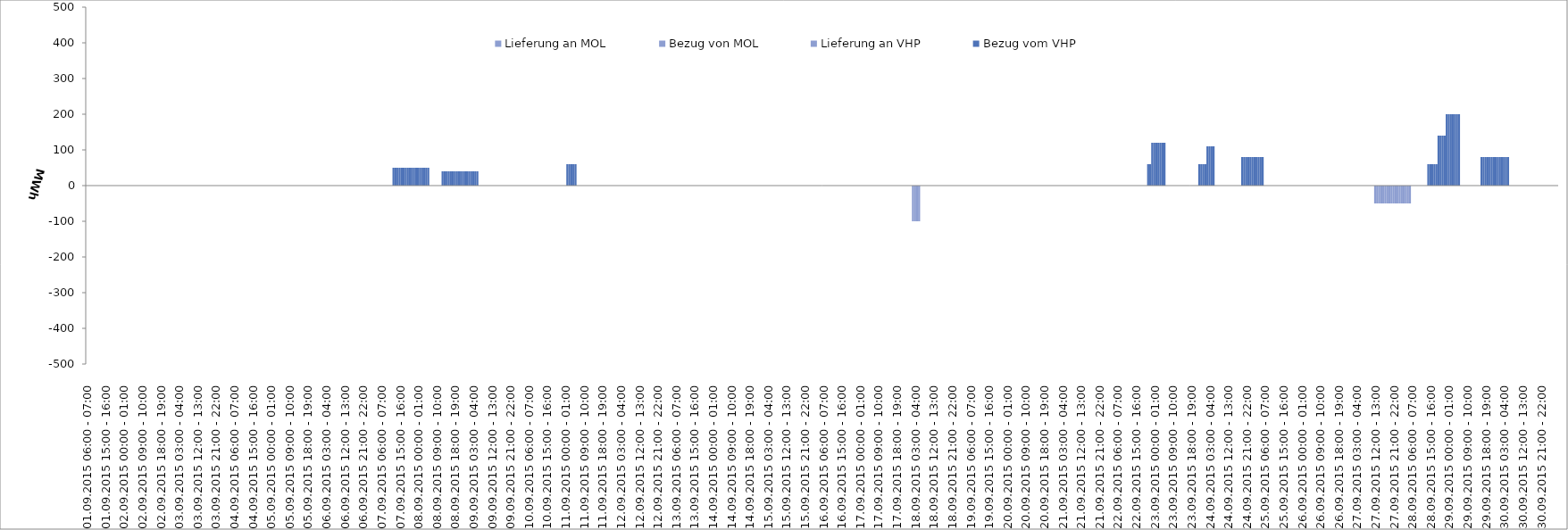
| Category | Bezug vom VHP | Lieferung an VHP | Bezug von MOL | Lieferung an MOL |
|---|---|---|---|---|
| 01.09.2015 06:00 - 07:00 | 0 | 0 | 0 | 0 |
| 01.09.2015 07:00 - 08:00 | 0 | 0 | 0 | 0 |
| 01.09.2015 08:00 - 09:00 | 0 | 0 | 0 | 0 |
| 01.09.2015 09:00 - 10:00 | 0 | 0 | 0 | 0 |
| 01.09.2015 10:00 - 11:00 | 0 | 0 | 0 | 0 |
| 01.09.2015 11:00 - 12:00 | 0 | 0 | 0 | 0 |
| 01.09.2015 12:00 - 13:00 | 0 | 0 | 0 | 0 |
| 01.09.2015 13:00 - 14:00 | 0 | 0 | 0 | 0 |
| 01.09.2015 14:00 - 15:00 | 0 | 0 | 0 | 0 |
| 01.09.2015 15:00 - 16:00 | 0 | 0 | 0 | 0 |
| 01.09.2015 16:00 - 17:00 | 0 | 0 | 0 | 0 |
| 01.09.2015 17:00 - 18:00 | 0 | 0 | 0 | 0 |
| 01.09.2015 18:00 - 19:00 | 0 | 0 | 0 | 0 |
| 01.09.2015 19:00 - 20:00 | 0 | 0 | 0 | 0 |
| 01.09.2015 20:00 - 21:00 | 0 | 0 | 0 | 0 |
| 01.09.2015 21:00 - 22:00 | 0 | 0 | 0 | 0 |
| 01.09.2015 22:00 - 23:00 | 0 | 0 | 0 | 0 |
| 01.09.2015 23:00 - 24:00 | 0 | 0 | 0 | 0 |
| 02.09.2015 00:00 - 01:00 | 0 | 0 | 0 | 0 |
| 02.09.2015 01:00 - 02:00 | 0 | 0 | 0 | 0 |
| 02.09.2015 02:00 - 03:00 | 0 | 0 | 0 | 0 |
| 02.09.2015 03:00 - 04:00 | 0 | 0 | 0 | 0 |
| 02.09.2015 04:00 - 05:00 | 0 | 0 | 0 | 0 |
| 02.09.2015 05:00 - 06:00 | 0 | 0 | 0 | 0 |
| 02.09.2015 06:00 - 07:00 | 0 | 0 | 0 | 0 |
| 02.09.2015 07:00 - 08:00 | 0 | 0 | 0 | 0 |
| 02.09.2015 08:00 - 09:00 | 0 | 0 | 0 | 0 |
| 02.09.2015 09:00 - 10:00 | 0 | 0 | 0 | 0 |
| 02.09.2015 10:00 - 11:00 | 0 | 0 | 0 | 0 |
| 02.09.2015 11:00 - 12:00 | 0 | 0 | 0 | 0 |
| 02.09.2015 12:00 - 13:00 | 0 | 0 | 0 | 0 |
| 02.09.2015 13:00 - 14:00 | 0 | 0 | 0 | 0 |
| 02.09.2015 14:00 - 15:00 | 0 | 0 | 0 | 0 |
| 02.09.2015 15:00 - 16:00 | 0 | 0 | 0 | 0 |
| 02.09.2015 16:00 - 17:00 | 0 | 0 | 0 | 0 |
| 02.09.2015 17:00 - 18:00 | 0 | 0 | 0 | 0 |
| 02.09.2015 18:00 - 19:00 | 0 | 0 | 0 | 0 |
| 02.09.2015 19:00 - 20:00 | 0 | 0 | 0 | 0 |
| 02.09.2015 20:00 - 21:00 | 0 | 0 | 0 | 0 |
| 02.09.2015 21:00 - 22:00 | 0 | 0 | 0 | 0 |
| 02.09.2015 22:00 - 23:00 | 0 | 0 | 0 | 0 |
| 02.09.2015 23:00 - 24:00 | 0 | 0 | 0 | 0 |
| 03.09.2015 00:00 - 01:00 | 0 | 0 | 0 | 0 |
| 03.09.2015 01:00 - 02:00 | 0 | 0 | 0 | 0 |
| 03.09.2015 02:00 - 03:00 | 0 | 0 | 0 | 0 |
| 03.09.2015 03:00 - 04:00 | 0 | 0 | 0 | 0 |
| 03.09.2015 04:00 - 05:00 | 0 | 0 | 0 | 0 |
| 03.09.2015 05:00 - 06:00 | 0 | 0 | 0 | 0 |
| 03.09.2015 06:00 - 07:00 | 0 | 0 | 0 | 0 |
| 03.09.2015 07:00 - 08:00 | 0 | 0 | 0 | 0 |
| 03.09.2015 08:00 - 09:00 | 0 | 0 | 0 | 0 |
| 03.09.2015 09:00 - 10:00 | 0 | 0 | 0 | 0 |
| 03.09.2015 10:00 - 11:00 | 0 | 0 | 0 | 0 |
| 03.09.2015 11:00 - 12:00 | 0 | 0 | 0 | 0 |
| 03.09.2015 12:00 - 13:00 | 0 | 0 | 0 | 0 |
| 03.09.2015 13:00 - 14:00 | 0 | 0 | 0 | 0 |
| 03.09.2015 14:00 - 15:00 | 0 | 0 | 0 | 0 |
| 03.09.2015 15:00 - 16:00 | 0 | 0 | 0 | 0 |
| 03.09.2015 16:00 - 17:00 | 0 | 0 | 0 | 0 |
| 03.09.2015 17:00 - 18:00 | 0 | 0 | 0 | 0 |
| 03.09.2015 18:00 - 19:00 | 0 | 0 | 0 | 0 |
| 03.09.2015 19:00 - 20:00 | 0 | 0 | 0 | 0 |
| 03.09.2015 20:00 - 21:00 | 0 | 0 | 0 | 0 |
| 03.09.2015 21:00 - 22:00 | 0 | 0 | 0 | 0 |
| 03.09.2015 22:00 - 23:00 | 0 | 0 | 0 | 0 |
| 03.09.2015 23:00 - 24:00 | 0 | 0 | 0 | 0 |
| 04.09.2015 00:00 - 01:00 | 0 | 0 | 0 | 0 |
| 04.09.2015 01:00 - 02:00 | 0 | 0 | 0 | 0 |
| 04.09.2015 02:00 - 03:00 | 0 | 0 | 0 | 0 |
| 04.09.2015 03:00 - 04:00 | 0 | 0 | 0 | 0 |
| 04.09.2015 04:00 - 05:00 | 0 | 0 | 0 | 0 |
| 04.09.2015 05:00 - 06:00 | 0 | 0 | 0 | 0 |
| 04.09.2015 06:00 - 07:00 | 0 | 0 | 0 | 0 |
| 04.09.2015 07:00 - 08:00 | 0 | 0 | 0 | 0 |
| 04.09.2015 08:00 - 09:00 | 0 | 0 | 0 | 0 |
| 04.09.2015 09:00 - 10:00 | 0 | 0 | 0 | 0 |
| 04.09.2015 10:00 - 11:00 | 0 | 0 | 0 | 0 |
| 04.09.2015 11:00 - 12:00 | 0 | 0 | 0 | 0 |
| 04.09.2015 12:00 - 13:00 | 0 | 0 | 0 | 0 |
| 04.09.2015 13:00 - 14:00 | 0 | 0 | 0 | 0 |
| 04.09.2015 14:00 - 15:00 | 0 | 0 | 0 | 0 |
| 04.09.2015 15:00 - 16:00 | 0 | 0 | 0 | 0 |
| 04.09.2015 16:00 - 17:00 | 0 | 0 | 0 | 0 |
| 04.09.2015 17:00 - 18:00 | 0 | 0 | 0 | 0 |
| 04.09.2015 18:00 - 19:00 | 0 | 0 | 0 | 0 |
| 04.09.2015 19:00 - 20:00 | 0 | 0 | 0 | 0 |
| 04.09.2015 20:00 - 21:00 | 0 | 0 | 0 | 0 |
| 04.09.2015 21:00 - 22:00 | 0 | 0 | 0 | 0 |
| 04.09.2015 22:00 - 23:00 | 0 | 0 | 0 | 0 |
| 04.09.2015 23:00 - 24:00 | 0 | 0 | 0 | 0 |
| 05.09.2015 00:00 - 01:00 | 0 | 0 | 0 | 0 |
| 05.09.2015 01:00 - 02:00 | 0 | 0 | 0 | 0 |
| 05.09.2015 02:00 - 03:00 | 0 | 0 | 0 | 0 |
| 05.09.2015 03:00 - 04:00 | 0 | 0 | 0 | 0 |
| 05.09.2015 04:00 - 05:00 | 0 | 0 | 0 | 0 |
| 05.09.2015 05:00 - 06:00 | 0 | 0 | 0 | 0 |
| 05.09.2015 06:00 - 07:00 | 0 | 0 | 0 | 0 |
| 05.09.2015 07:00 - 08:00 | 0 | 0 | 0 | 0 |
| 05.09.2015 08:00 - 09:00 | 0 | 0 | 0 | 0 |
| 05.09.2015 09:00 - 10:00 | 0 | 0 | 0 | 0 |
| 05.09.2015 10:00 - 11:00 | 0 | 0 | 0 | 0 |
| 05.09.2015 11:00 - 12:00 | 0 | 0 | 0 | 0 |
| 05.09.2015 12:00 - 13:00 | 0 | 0 | 0 | 0 |
| 05.09.2015 13:00 - 14:00 | 0 | 0 | 0 | 0 |
| 05.09.2015 14:00 - 15:00 | 0 | 0 | 0 | 0 |
| 05.09.2015 15:00 - 16:00 | 0 | 0 | 0 | 0 |
| 05.09.2015 16:00 - 17:00 | 0 | 0 | 0 | 0 |
| 05.09.2015 17:00 - 18:00 | 0 | 0 | 0 | 0 |
| 05.09.2015 18:00 - 19:00 | 0 | 0 | 0 | 0 |
| 05.09.2015 19:00 - 20:00 | 0 | 0 | 0 | 0 |
| 05.09.2015 20:00 - 21:00 | 0 | 0 | 0 | 0 |
| 05.09.2015 21:00 - 22:00 | 0 | 0 | 0 | 0 |
| 05.09.2015 22:00 - 23:00 | 0 | 0 | 0 | 0 |
| 05.09.2015 23:00 - 24:00 | 0 | 0 | 0 | 0 |
| 06.09.2015 00:00 - 01:00 | 0 | 0 | 0 | 0 |
| 06.09.2015 01:00 - 02:00 | 0 | 0 | 0 | 0 |
| 06.09.2015 02:00 - 03:00 | 0 | 0 | 0 | 0 |
| 06.09.2015 03:00 - 04:00 | 0 | 0 | 0 | 0 |
| 06.09.2015 04:00 - 05:00 | 0 | 0 | 0 | 0 |
| 06.09.2015 05:00 - 06:00 | 0 | 0 | 0 | 0 |
| 06.09.2015 06:00 - 07:00 | 0 | 0 | 0 | 0 |
| 06.09.2015 07:00 - 08:00 | 0 | 0 | 0 | 0 |
| 06.09.2015 08:00 - 09:00 | 0 | 0 | 0 | 0 |
| 06.09.2015 09:00 - 10:00 | 0 | 0 | 0 | 0 |
| 06.09.2015 10:00 - 11:00 | 0 | 0 | 0 | 0 |
| 06.09.2015 11:00 - 12:00 | 0 | 0 | 0 | 0 |
| 06.09.2015 12:00 - 13:00 | 0 | 0 | 0 | 0 |
| 06.09.2015 13:00 - 14:00 | 0 | 0 | 0 | 0 |
| 06.09.2015 14:00 - 15:00 | 0 | 0 | 0 | 0 |
| 06.09.2015 15:00 - 16:00 | 0 | 0 | 0 | 0 |
| 06.09.2015 16:00 - 17:00 | 0 | 0 | 0 | 0 |
| 06.09.2015 17:00 - 18:00 | 0 | 0 | 0 | 0 |
| 06.09.2015 18:00 - 19:00 | 0 | 0 | 0 | 0 |
| 06.09.2015 19:00 - 20:00 | 0 | 0 | 0 | 0 |
| 06.09.2015 20:00 - 21:00 | 0 | 0 | 0 | 0 |
| 06.09.2015 21:00 - 22:00 | 0 | 0 | 0 | 0 |
| 06.09.2015 22:00 - 23:00 | 0 | 0 | 0 | 0 |
| 06.09.2015 23:00 - 24:00 | 0 | 0 | 0 | 0 |
| 07.09.2015 00:00 - 01:00 | 0 | 0 | 0 | 0 |
| 07.09.2015 01:00 - 02:00 | 0 | 0 | 0 | 0 |
| 07.09.2015 02:00 - 03:00 | 0 | 0 | 0 | 0 |
| 07.09.2015 03:00 - 04:00 | 0 | 0 | 0 | 0 |
| 07.09.2015 04:00 - 05:00 | 0 | 0 | 0 | 0 |
| 07.09.2015 05:00 - 06:00 | 0 | 0 | 0 | 0 |
| 07.09.2015 06:00 - 07:00 | 0 | 0 | 0 | 0 |
| 07.09.2015 07:00 - 08:00 | 0 | 0 | 0 | 0 |
| 07.09.2015 08:00 - 09:00 | 0 | 0 | 0 | 0 |
| 07.09.2015 09:00 - 10:00 | 0 | 0 | 0 | 0 |
| 07.09.2015 10:00 - 11:00 | 0 | 0 | 0 | 0 |
| 07.09.2015 11:00 - 12:00 | 0 | 0 | 0 | 0 |
| 07.09.2015 12:00 - 13:00 | 50 | 0 | 0 | 0 |
| 07.09.2015 13:00 - 14:00 | 50 | 0 | 0 | 0 |
| 07.09.2015 14:00 - 15:00 | 50 | 0 | 0 | 0 |
| 07.09.2015 15:00 - 16:00 | 50 | 0 | 0 | 0 |
| 07.09.2015 16:00 - 17:00 | 50 | 0 | 0 | 0 |
| 07.09.2015 17:00 - 18:00 | 50 | 0 | 0 | 0 |
| 07.09.2015 18:00 - 19:00 | 50 | 0 | 0 | 0 |
| 07.09.2015 19:00 - 20:00 | 50 | 0 | 0 | 0 |
| 07.09.2015 20:00 - 21:00 | 50 | 0 | 0 | 0 |
| 07.09.2015 21:00 - 22:00 | 50 | 0 | 0 | 0 |
| 07.09.2015 22:00 - 23:00 | 50 | 0 | 0 | 0 |
| 07.09.2015 23:00 - 24:00 | 50 | 0 | 0 | 0 |
| 08.09.2015 00:00 - 01:00 | 50 | 0 | 0 | 0 |
| 08.09.2015 01:00 - 02:00 | 50 | 0 | 0 | 0 |
| 08.09.2015 02:00 - 03:00 | 50 | 0 | 0 | 0 |
| 08.09.2015 03:00 - 04:00 | 50 | 0 | 0 | 0 |
| 08.09.2015 04:00 - 05:00 | 50 | 0 | 0 | 0 |
| 08.09.2015 05:00 - 06:00 | 50 | 0 | 0 | 0 |
| 08.09.2015 06:00 - 07:00 | 0 | 0 | 0 | 0 |
| 08.09.2015 07:00 - 08:00 | 0 | 0 | 0 | 0 |
| 08.09.2015 08:00 - 09:00 | 0 | 0 | 0 | 0 |
| 08.09.2015 09:00 - 10:00 | 0 | 0 | 0 | 0 |
| 08.09.2015 10:00 - 11:00 | 0 | 0 | 0 | 0 |
| 08.09.2015 11:00 - 12:00 | 0 | 0 | 0 | 0 |
| 08.09.2015 12:00 - 13:00 | 40 | 0 | 0 | 0 |
| 08.09.2015 13:00 - 14:00 | 40 | 0 | 0 | 0 |
| 08.09.2015 14:00 - 15:00 | 40 | 0 | 0 | 0 |
| 08.09.2015 15:00 - 16:00 | 40 | 0 | 0 | 0 |
| 08.09.2015 16:00 - 17:00 | 40 | 0 | 0 | 0 |
| 08.09.2015 17:00 - 18:00 | 40 | 0 | 0 | 0 |
| 08.09.2015 18:00 - 19:00 | 40 | 0 | 0 | 0 |
| 08.09.2015 19:00 - 20:00 | 40 | 0 | 0 | 0 |
| 08.09.2015 20:00 - 21:00 | 40 | 0 | 0 | 0 |
| 08.09.2015 21:00 - 22:00 | 40 | 0 | 0 | 0 |
| 08.09.2015 22:00 - 23:00 | 40 | 0 | 0 | 0 |
| 08.09.2015 23:00 - 24:00 | 40 | 0 | 0 | 0 |
| 09.09.2015 00:00 - 01:00 | 40 | 0 | 0 | 0 |
| 09.09.2015 01:00 - 02:00 | 40 | 0 | 0 | 0 |
| 09.09.2015 02:00 - 03:00 | 40 | 0 | 0 | 0 |
| 09.09.2015 03:00 - 04:00 | 40 | 0 | 0 | 0 |
| 09.09.2015 04:00 - 05:00 | 40 | 0 | 0 | 0 |
| 09.09.2015 05:00 - 06:00 | 40 | 0 | 0 | 0 |
| 09.09.2015 06:00 - 07:00 | 0 | 0 | 0 | 0 |
| 09.09.2015 07:00 - 08:00 | 0 | 0 | 0 | 0 |
| 09.09.2015 08:00 - 09:00 | 0 | 0 | 0 | 0 |
| 09.09.2015 09:00 - 10:00 | 0 | 0 | 0 | 0 |
| 09.09.2015 10:00 - 11:00 | 0 | 0 | 0 | 0 |
| 09.09.2015 11:00 - 12:00 | 0 | 0 | 0 | 0 |
| 09.09.2015 12:00 - 13:00 | 0 | 0 | 0 | 0 |
| 09.09.2015 13:00 - 14:00 | 0 | 0 | 0 | 0 |
| 09.09.2015 14:00 - 15:00 | 0 | 0 | 0 | 0 |
| 09.09.2015 15:00 - 16:00 | 0 | 0 | 0 | 0 |
| 09.09.2015 16:00 - 17:00 | 0 | 0 | 0 | 0 |
| 09.09.2015 17:00 - 18:00 | 0 | 0 | 0 | 0 |
| 09.09.2015 18:00 - 19:00 | 0 | 0 | 0 | 0 |
| 09.09.2015 19:00 - 20:00 | 0 | 0 | 0 | 0 |
| 09.09.2015 20:00 - 21:00 | 0 | 0 | 0 | 0 |
| 09.09.2015 21:00 - 22:00 | 0 | 0 | 0 | 0 |
| 09.09.2015 22:00 - 23:00 | 0 | 0 | 0 | 0 |
| 09.09.2015 23:00 - 24:00 | 0 | 0 | 0 | 0 |
| 10.09.2015 00:00 - 01:00 | 0 | 0 | 0 | 0 |
| 10.09.2015 01:00 - 02:00 | 0 | 0 | 0 | 0 |
| 10.09.2015 02:00 - 03:00 | 0 | 0 | 0 | 0 |
| 10.09.2015 03:00 - 04:00 | 0 | 0 | 0 | 0 |
| 10.09.2015 04:00 - 05:00 | 0 | 0 | 0 | 0 |
| 10.09.2015 05:00 - 06:00 | 0 | 0 | 0 | 0 |
| 10.09.2015 06:00 - 07:00 | 0 | 0 | 0 | 0 |
| 10.09.2015 07:00 - 08:00 | 0 | 0 | 0 | 0 |
| 10.09.2015 08:00 - 09:00 | 0 | 0 | 0 | 0 |
| 10.09.2015 09:00 - 10:00 | 0 | 0 | 0 | 0 |
| 10.09.2015 10:00 - 11:00 | 0 | 0 | 0 | 0 |
| 10.09.2015 11:00 - 12:00 | 0 | 0 | 0 | 0 |
| 10.09.2015 12:00 - 13:00 | 0 | 0 | 0 | 0 |
| 10.09.2015 13:00 - 14:00 | 0 | 0 | 0 | 0 |
| 10.09.2015 14:00 - 15:00 | 0 | 0 | 0 | 0 |
| 10.09.2015 15:00 - 16:00 | 0 | 0 | 0 | 0 |
| 10.09.2015 16:00 - 17:00 | 0 | 0 | 0 | 0 |
| 10.09.2015 17:00 - 18:00 | 0 | 0 | 0 | 0 |
| 10.09.2015 18:00 - 19:00 | 0 | 0 | 0 | 0 |
| 10.09.2015 19:00 - 20:00 | 0 | 0 | 0 | 0 |
| 10.09.2015 20:00 - 21:00 | 0 | 0 | 0 | 0 |
| 10.09.2015 21:00 - 22:00 | 0 | 0 | 0 | 0 |
| 10.09.2015 22:00 - 23:00 | 0 | 0 | 0 | 0 |
| 10.09.2015 23:00 - 24:00 | 0 | 0 | 0 | 0 |
| 11.09.2015 00:00 - 01:00 | 0 | 0 | 0 | 0 |
| 11.09.2015 01:00 - 02:00 | 60 | 0 | 0 | 0 |
| 11.09.2015 02:00 - 03:00 | 60 | 0 | 0 | 0 |
| 11.09.2015 03:00 - 04:00 | 60 | 0 | 0 | 0 |
| 11.09.2015 04:00 - 05:00 | 60 | 0 | 0 | 0 |
| 11.09.2015 05:00 - 06:00 | 60 | 0 | 0 | 0 |
| 11.09.2015 06:00 - 07:00 | 0 | 0 | 0 | 0 |
| 11.09.2015 07:00 - 08:00 | 0 | 0 | 0 | 0 |
| 11.09.2015 08:00 - 09:00 | 0 | 0 | 0 | 0 |
| 11.09.2015 09:00 - 10:00 | 0 | 0 | 0 | 0 |
| 11.09.2015 10:00 - 11:00 | 0 | 0 | 0 | 0 |
| 11.09.2015 11:00 - 12:00 | 0 | 0 | 0 | 0 |
| 11.09.2015 12:00 - 13:00 | 0 | 0 | 0 | 0 |
| 11.09.2015 13:00 - 14:00 | 0 | 0 | 0 | 0 |
| 11.09.2015 14:00 - 15:00 | 0 | 0 | 0 | 0 |
| 11.09.2015 15:00 - 16:00 | 0 | 0 | 0 | 0 |
| 11.09.2015 16:00 - 17:00 | 0 | 0 | 0 | 0 |
| 11.09.2015 17:00 - 18:00 | 0 | 0 | 0 | 0 |
| 11.09.2015 18:00 - 19:00 | 0 | 0 | 0 | 0 |
| 11.09.2015 19:00 - 20:00 | 0 | 0 | 0 | 0 |
| 11.09.2015 20:00 - 21:00 | 0 | 0 | 0 | 0 |
| 11.09.2015 21:00 - 22:00 | 0 | 0 | 0 | 0 |
| 11.09.2015 22:00 - 23:00 | 0 | 0 | 0 | 0 |
| 11.09.2015 23:00 - 24:00 | 0 | 0 | 0 | 0 |
| 12.09.2015 00:00 - 01:00 | 0 | 0 | 0 | 0 |
| 12.09.2015 01:00 - 02:00 | 0 | 0 | 0 | 0 |
| 12.09.2015 02:00 - 03:00 | 0 | 0 | 0 | 0 |
| 12.09.2015 03:00 - 04:00 | 0 | 0 | 0 | 0 |
| 12.09.2015 04:00 - 05:00 | 0 | 0 | 0 | 0 |
| 12.09.2015 05:00 - 06:00 | 0 | 0 | 0 | 0 |
| 12.09.2015 06:00 - 07:00 | 0 | 0 | 0 | 0 |
| 12.09.2015 07:00 - 08:00 | 0 | 0 | 0 | 0 |
| 12.09.2015 08:00 - 09:00 | 0 | 0 | 0 | 0 |
| 12.09.2015 09:00 - 10:00 | 0 | 0 | 0 | 0 |
| 12.09.2015 10:00 - 11:00 | 0 | 0 | 0 | 0 |
| 12.09.2015 11:00 - 12:00 | 0 | 0 | 0 | 0 |
| 12.09.2015 12:00 - 13:00 | 0 | 0 | 0 | 0 |
| 12.09.2015 13:00 - 14:00 | 0 | 0 | 0 | 0 |
| 12.09.2015 14:00 - 15:00 | 0 | 0 | 0 | 0 |
| 12.09.2015 15:00 - 16:00 | 0 | 0 | 0 | 0 |
| 12.09.2015 16:00 - 17:00 | 0 | 0 | 0 | 0 |
| 12.09.2015 17:00 - 18:00 | 0 | 0 | 0 | 0 |
| 12.09.2015 18:00 - 19:00 | 0 | 0 | 0 | 0 |
| 12.09.2015 19:00 - 20:00 | 0 | 0 | 0 | 0 |
| 12.09.2015 20:00 - 21:00 | 0 | 0 | 0 | 0 |
| 12.09.2015 21:00 - 22:00 | 0 | 0 | 0 | 0 |
| 12.09.2015 22:00 - 23:00 | 0 | 0 | 0 | 0 |
| 12.09.2015 23:00 - 24:00 | 0 | 0 | 0 | 0 |
| 13.09.2015 00:00 - 01:00 | 0 | 0 | 0 | 0 |
| 13.09.2015 01:00 - 02:00 | 0 | 0 | 0 | 0 |
| 13.09.2015 02:00 - 03:00 | 0 | 0 | 0 | 0 |
| 13.09.2015 03:00 - 04:00 | 0 | 0 | 0 | 0 |
| 13.09.2015 04:00 - 05:00 | 0 | 0 | 0 | 0 |
| 13.09.2015 05:00 - 06:00 | 0 | 0 | 0 | 0 |
| 13.09.2015 06:00 - 07:00 | 0 | 0 | 0 | 0 |
| 13.09.2015 07:00 - 08:00 | 0 | 0 | 0 | 0 |
| 13.09.2015 08:00 - 09:00 | 0 | 0 | 0 | 0 |
| 13.09.2015 09:00 - 10:00 | 0 | 0 | 0 | 0 |
| 13.09.2015 10:00 - 11:00 | 0 | 0 | 0 | 0 |
| 13.09.2015 11:00 - 12:00 | 0 | 0 | 0 | 0 |
| 13.09.2015 12:00 - 13:00 | 0 | 0 | 0 | 0 |
| 13.09.2015 13:00 - 14:00 | 0 | 0 | 0 | 0 |
| 13.09.2015 14:00 - 15:00 | 0 | 0 | 0 | 0 |
| 13.09.2015 15:00 - 16:00 | 0 | 0 | 0 | 0 |
| 13.09.2015 16:00 - 17:00 | 0 | 0 | 0 | 0 |
| 13.09.2015 17:00 - 18:00 | 0 | 0 | 0 | 0 |
| 13.09.2015 18:00 - 19:00 | 0 | 0 | 0 | 0 |
| 13.09.2015 19:00 - 20:00 | 0 | 0 | 0 | 0 |
| 13.09.2015 20:00 - 21:00 | 0 | 0 | 0 | 0 |
| 13.09.2015 21:00 - 22:00 | 0 | 0 | 0 | 0 |
| 13.09.2015 22:00 - 23:00 | 0 | 0 | 0 | 0 |
| 13.09.2015 23:00 - 24:00 | 0 | 0 | 0 | 0 |
| 14.09.2015 00:00 - 01:00 | 0 | 0 | 0 | 0 |
| 14.09.2015 01:00 - 02:00 | 0 | 0 | 0 | 0 |
| 14.09.2015 02:00 - 03:00 | 0 | 0 | 0 | 0 |
| 14.09.2015 03:00 - 04:00 | 0 | 0 | 0 | 0 |
| 14.09.2015 04:00 - 05:00 | 0 | 0 | 0 | 0 |
| 14.09.2015 05:00 - 06:00 | 0 | 0 | 0 | 0 |
| 14.09.2015 06:00 - 07:00 | 0 | 0 | 0 | 0 |
| 14.09.2015 07:00 - 08:00 | 0 | 0 | 0 | 0 |
| 14.09.2015 08:00 - 09:00 | 0 | 0 | 0 | 0 |
| 14.09.2015 09:00 - 10:00 | 0 | 0 | 0 | 0 |
| 14.09.2015 10:00 - 11:00 | 0 | 0 | 0 | 0 |
| 14.09.2015 11:00 - 12:00 | 0 | 0 | 0 | 0 |
| 14.09.2015 12:00 - 13:00 | 0 | 0 | 0 | 0 |
| 14.09.2015 13:00 - 14:00 | 0 | 0 | 0 | 0 |
| 14.09.2015 14:00 - 15:00 | 0 | 0 | 0 | 0 |
| 14.09.2015 15:00 - 16:00 | 0 | 0 | 0 | 0 |
| 14.09.2015 16:00 - 17:00 | 0 | 0 | 0 | 0 |
| 14.09.2015 17:00 - 18:00 | 0 | 0 | 0 | 0 |
| 14.09.2015 18:00 - 19:00 | 0 | 0 | 0 | 0 |
| 14.09.2015 19:00 - 20:00 | 0 | 0 | 0 | 0 |
| 14.09.2015 20:00 - 21:00 | 0 | 0 | 0 | 0 |
| 14.09.2015 21:00 - 22:00 | 0 | 0 | 0 | 0 |
| 14.09.2015 22:00 - 23:00 | 0 | 0 | 0 | 0 |
| 14.09.2015 23:00 - 24:00 | 0 | 0 | 0 | 0 |
| 15.09.2015 00:00 - 01:00 | 0 | 0 | 0 | 0 |
| 15.09.2015 01:00 - 02:00 | 0 | 0 | 0 | 0 |
| 15.09.2015 02:00 - 03:00 | 0 | 0 | 0 | 0 |
| 15.09.2015 03:00 - 04:00 | 0 | 0 | 0 | 0 |
| 15.09.2015 04:00 - 05:00 | 0 | 0 | 0 | 0 |
| 15.09.2015 05:00 - 06:00 | 0 | 0 | 0 | 0 |
| 15.09.2015 06:00 - 07:00 | 0 | 0 | 0 | 0 |
| 15.09.2015 07:00 - 08:00 | 0 | 0 | 0 | 0 |
| 15.09.2015 08:00 - 09:00 | 0 | 0 | 0 | 0 |
| 15.09.2015 09:00 - 10:00 | 0 | 0 | 0 | 0 |
| 15.09.2015 10:00 - 11:00 | 0 | 0 | 0 | 0 |
| 15.09.2015 11:00 - 12:00 | 0 | 0 | 0 | 0 |
| 15.09.2015 12:00 - 13:00 | 0 | 0 | 0 | 0 |
| 15.09.2015 13:00 - 14:00 | 0 | 0 | 0 | 0 |
| 15.09.2015 14:00 - 15:00 | 0 | 0 | 0 | 0 |
| 15.09.2015 15:00 - 16:00 | 0 | 0 | 0 | 0 |
| 15.09.2015 16:00 - 17:00 | 0 | 0 | 0 | 0 |
| 15.09.2015 17:00 - 18:00 | 0 | 0 | 0 | 0 |
| 15.09.2015 18:00 - 19:00 | 0 | 0 | 0 | 0 |
| 15.09.2015 19:00 - 20:00 | 0 | 0 | 0 | 0 |
| 15.09.2015 20:00 - 21:00 | 0 | 0 | 0 | 0 |
| 15.09.2015 21:00 - 22:00 | 0 | 0 | 0 | 0 |
| 15.09.2015 22:00 - 23:00 | 0 | 0 | 0 | 0 |
| 15.09.2015 23:00 - 24:00 | 0 | 0 | 0 | 0 |
| 16.09.2015 00:00 - 01:00 | 0 | 0 | 0 | 0 |
| 16.09.2015 01:00 - 02:00 | 0 | 0 | 0 | 0 |
| 16.09.2015 02:00 - 03:00 | 0 | 0 | 0 | 0 |
| 16.09.2015 03:00 - 04:00 | 0 | 0 | 0 | 0 |
| 16.09.2015 04:00 - 05:00 | 0 | 0 | 0 | 0 |
| 16.09.2015 05:00 - 06:00 | 0 | 0 | 0 | 0 |
| 16.09.2015 06:00 - 07:00 | 0 | 0 | 0 | 0 |
| 16.09.2015 07:00 - 08:00 | 0 | 0 | 0 | 0 |
| 16.09.2015 08:00 - 09:00 | 0 | 0 | 0 | 0 |
| 16.09.2015 09:00 - 10:00 | 0 | 0 | 0 | 0 |
| 16.09.2015 10:00 - 11:00 | 0 | 0 | 0 | 0 |
| 16.09.2015 11:00 - 12:00 | 0 | 0 | 0 | 0 |
| 16.09.2015 12:00 - 13:00 | 0 | 0 | 0 | 0 |
| 16.09.2015 13:00 - 14:00 | 0 | 0 | 0 | 0 |
| 16.09.2015 14:00 - 15:00 | 0 | 0 | 0 | 0 |
| 16.09.2015 15:00 - 16:00 | 0 | 0 | 0 | 0 |
| 16.09.2015 16:00 - 17:00 | 0 | 0 | 0 | 0 |
| 16.09.2015 17:00 - 18:00 | 0 | 0 | 0 | 0 |
| 16.09.2015 18:00 - 19:00 | 0 | 0 | 0 | 0 |
| 16.09.2015 19:00 - 20:00 | 0 | 0 | 0 | 0 |
| 16.09.2015 20:00 - 21:00 | 0 | 0 | 0 | 0 |
| 16.09.2015 21:00 - 22:00 | 0 | 0 | 0 | 0 |
| 16.09.2015 22:00 - 23:00 | 0 | 0 | 0 | 0 |
| 16.09.2015 23:00 - 24:00 | 0 | 0 | 0 | 0 |
| 17.09.2015 00:00 - 01:00 | 0 | 0 | 0 | 0 |
| 17.09.2015 01:00 - 02:00 | 0 | 0 | 0 | 0 |
| 17.09.2015 02:00 - 03:00 | 0 | 0 | 0 | 0 |
| 17.09.2015 03:00 - 04:00 | 0 | 0 | 0 | 0 |
| 17.09.2015 04:00 - 05:00 | 0 | 0 | 0 | 0 |
| 17.09.2015 05:00 - 06:00 | 0 | 0 | 0 | 0 |
| 17.09.2015 06:00 - 07:00 | 0 | 0 | 0 | 0 |
| 17.09.2015 07:00 - 08:00 | 0 | 0 | 0 | 0 |
| 17.09.2015 08:00 - 09:00 | 0 | 0 | 0 | 0 |
| 17.09.2015 09:00 - 10:00 | 0 | 0 | 0 | 0 |
| 17.09.2015 10:00 - 11:00 | 0 | 0 | 0 | 0 |
| 17.09.2015 11:00 - 12:00 | 0 | 0 | 0 | 0 |
| 17.09.2015 12:00 - 13:00 | 0 | 0 | 0 | 0 |
| 17.09.2015 13:00 - 14:00 | 0 | 0 | 0 | 0 |
| 17.09.2015 14:00 - 15:00 | 0 | 0 | 0 | 0 |
| 17.09.2015 15:00 - 16:00 | 0 | 0 | 0 | 0 |
| 17.09.2015 16:00 - 17:00 | 0 | 0 | 0 | 0 |
| 17.09.2015 17:00 - 18:00 | 0 | 0 | 0 | 0 |
| 17.09.2015 18:00 - 19:00 | 0 | 0 | 0 | 0 |
| 17.09.2015 19:00 - 20:00 | 0 | 0 | 0 | 0 |
| 17.09.2015 20:00 - 21:00 | 0 | 0 | 0 | 0 |
| 17.09.2015 21:00 - 22:00 | 0 | 0 | 0 | 0 |
| 17.09.2015 22:00 - 23:00 | 0 | 0 | 0 | 0 |
| 17.09.2015 23:00 - 24:00 | 0 | 0 | 0 | 0 |
| 18.09.2015 00:00 - 01:00 | 0 | 0 | 0 | 0 |
| 18.09.2015 01:00 - 02:00 | 0 | 0 | 0 | 0 |
| 18.09.2015 02:00 - 03:00 | 0 | -100 | 0 | 0 |
| 18.09.2015 03:00 - 04:00 | 0 | -100 | 0 | 0 |
| 18.09.2015 04:00 - 05:00 | 0 | -100 | 0 | 0 |
| 18.09.2015 05:00 - 06:00 | 0 | -100 | 0 | 0 |
| 18.09.2015 06:00 - 07:00 | 0 | 0 | 0 | 0 |
| 18.09.2015 07:00 - 08:00 | 0 | 0 | 0 | 0 |
| 18.09.2015 08:00 - 09:00 | 0 | 0 | 0 | 0 |
| 18.09.2015 09:00 - 10:00 | 0 | 0 | 0 | 0 |
| 18.09.2015 10:00 - 11:00 | 0 | 0 | 0 | 0 |
| 18.09.2015 11:00 - 12:00 | 0 | 0 | 0 | 0 |
| 18.09.2015 12:00 - 13:00 | 0 | 0 | 0 | 0 |
| 18.09.2015 13:00 - 14:00 | 0 | 0 | 0 | 0 |
| 18.09.2015 14:00 - 15:00 | 0 | 0 | 0 | 0 |
| 18.09.2015 15:00 - 16:00 | 0 | 0 | 0 | 0 |
| 18.09.2015 16:00 - 17:00 | 0 | 0 | 0 | 0 |
| 18.09.2015 17:00 - 18:00 | 0 | 0 | 0 | 0 |
| 18.09.2015 18:00 - 19:00 | 0 | 0 | 0 | 0 |
| 18.09.2015 19:00 - 20:00 | 0 | 0 | 0 | 0 |
| 18.09.2015 20:00 - 21:00 | 0 | 0 | 0 | 0 |
| 18.09.2015 21:00 - 22:00 | 0 | 0 | 0 | 0 |
| 18.09.2015 22:00 - 23:00 | 0 | 0 | 0 | 0 |
| 18.09.2015 23:00 - 24:00 | 0 | 0 | 0 | 0 |
| 19.09.2015 00:00 - 01:00 | 0 | 0 | 0 | 0 |
| 19.09.2015 01:00 - 02:00 | 0 | 0 | 0 | 0 |
| 19.09.2015 02:00 - 03:00 | 0 | 0 | 0 | 0 |
| 19.09.2015 03:00 - 04:00 | 0 | 0 | 0 | 0 |
| 19.09.2015 04:00 - 05:00 | 0 | 0 | 0 | 0 |
| 19.09.2015 05:00 - 06:00 | 0 | 0 | 0 | 0 |
| 19.09.2015 06:00 - 07:00 | 0 | 0 | 0 | 0 |
| 19.09.2015 07:00 - 08:00 | 0 | 0 | 0 | 0 |
| 19.09.2015 08:00 - 09:00 | 0 | 0 | 0 | 0 |
| 19.09.2015 09:00 - 10:00 | 0 | 0 | 0 | 0 |
| 19.09.2015 10:00 - 11:00 | 0 | 0 | 0 | 0 |
| 19.09.2015 11:00 - 12:00 | 0 | 0 | 0 | 0 |
| 19.09.2015 12:00 - 13:00 | 0 | 0 | 0 | 0 |
| 19.09.2015 13:00 - 14:00 | 0 | 0 | 0 | 0 |
| 19.09.2015 14:00 - 15:00 | 0 | 0 | 0 | 0 |
| 19.09.2015 15:00 - 16:00 | 0 | 0 | 0 | 0 |
| 19.09.2015 16:00 - 17:00 | 0 | 0 | 0 | 0 |
| 19.09.2015 17:00 - 18:00 | 0 | 0 | 0 | 0 |
| 19.09.2015 18:00 - 19:00 | 0 | 0 | 0 | 0 |
| 19.09.2015 19:00 - 20:00 | 0 | 0 | 0 | 0 |
| 19.09.2015 20:00 - 21:00 | 0 | 0 | 0 | 0 |
| 19.09.2015 21:00 - 22:00 | 0 | 0 | 0 | 0 |
| 19.09.2015 22:00 - 23:00 | 0 | 0 | 0 | 0 |
| 19.09.2015 23:00 - 24:00 | 0 | 0 | 0 | 0 |
| 20.09.2015 00:00 - 01:00 | 0 | 0 | 0 | 0 |
| 20.09.2015 01:00 - 02:00 | 0 | 0 | 0 | 0 |
| 20.09.2015 02:00 - 03:00 | 0 | 0 | 0 | 0 |
| 20.09.2015 03:00 - 04:00 | 0 | 0 | 0 | 0 |
| 20.09.2015 04:00 - 05:00 | 0 | 0 | 0 | 0 |
| 20.09.2015 05:00 - 06:00 | 0 | 0 | 0 | 0 |
| 20.09.2015 06:00 - 07:00 | 0 | 0 | 0 | 0 |
| 20.09.2015 07:00 - 08:00 | 0 | 0 | 0 | 0 |
| 20.09.2015 08:00 - 09:00 | 0 | 0 | 0 | 0 |
| 20.09.2015 09:00 - 10:00 | 0 | 0 | 0 | 0 |
| 20.09.2015 10:00 - 11:00 | 0 | 0 | 0 | 0 |
| 20.09.2015 11:00 - 12:00 | 0 | 0 | 0 | 0 |
| 20.09.2015 12:00 - 13:00 | 0 | 0 | 0 | 0 |
| 20.09.2015 13:00 - 14:00 | 0 | 0 | 0 | 0 |
| 20.09.2015 14:00 - 15:00 | 0 | 0 | 0 | 0 |
| 20.09.2015 15:00 - 16:00 | 0 | 0 | 0 | 0 |
| 20.09.2015 16:00 - 17:00 | 0 | 0 | 0 | 0 |
| 20.09.2015 17:00 - 18:00 | 0 | 0 | 0 | 0 |
| 20.09.2015 18:00 - 19:00 | 0 | 0 | 0 | 0 |
| 20.09.2015 19:00 - 20:00 | 0 | 0 | 0 | 0 |
| 20.09.2015 20:00 - 21:00 | 0 | 0 | 0 | 0 |
| 20.09.2015 21:00 - 22:00 | 0 | 0 | 0 | 0 |
| 20.09.2015 22:00 - 23:00 | 0 | 0 | 0 | 0 |
| 20.09.2015 23:00 - 24:00 | 0 | 0 | 0 | 0 |
| 21.09.2015 00:00 - 01:00 | 0 | 0 | 0 | 0 |
| 21.09.2015 01:00 - 02:00 | 0 | 0 | 0 | 0 |
| 21.09.2015 02:00 - 03:00 | 0 | 0 | 0 | 0 |
| 21.09.2015 03:00 - 04:00 | 0 | 0 | 0 | 0 |
| 21.09.2015 04:00 - 05:00 | 0 | 0 | 0 | 0 |
| 21.09.2015 05:00 - 06:00 | 0 | 0 | 0 | 0 |
| 21.09.2015 06:00 - 07:00 | 0 | 0 | 0 | 0 |
| 21.09.2015 07:00 - 08:00 | 0 | 0 | 0 | 0 |
| 21.09.2015 08:00 - 09:00 | 0 | 0 | 0 | 0 |
| 21.09.2015 09:00 - 10:00 | 0 | 0 | 0 | 0 |
| 21.09.2015 10:00 - 11:00 | 0 | 0 | 0 | 0 |
| 21.09.2015 11:00 - 12:00 | 0 | 0 | 0 | 0 |
| 21.09.2015 12:00 - 13:00 | 0 | 0 | 0 | 0 |
| 21.09.2015 13:00 - 14:00 | 0 | 0 | 0 | 0 |
| 21.09.2015 14:00 - 15:00 | 0 | 0 | 0 | 0 |
| 21.09.2015 15:00 - 16:00 | 0 | 0 | 0 | 0 |
| 21.09.2015 16:00 - 17:00 | 0 | 0 | 0 | 0 |
| 21.09.2015 17:00 - 18:00 | 0 | 0 | 0 | 0 |
| 21.09.2015 18:00 - 19:00 | 0 | 0 | 0 | 0 |
| 21.09.2015 19:00 - 20:00 | 0 | 0 | 0 | 0 |
| 21.09.2015 20:00 - 21:00 | 0 | 0 | 0 | 0 |
| 21.09.2015 21:00 - 22:00 | 0 | 0 | 0 | 0 |
| 21.09.2015 22:00 - 23:00 | 0 | 0 | 0 | 0 |
| 21.09.2015 23:00 - 24:00 | 0 | 0 | 0 | 0 |
| 22.09.2015 00:00 - 01:00 | 0 | 0 | 0 | 0 |
| 22.09.2015 01:00 - 02:00 | 0 | 0 | 0 | 0 |
| 22.09.2015 02:00 - 03:00 | 0 | 0 | 0 | 0 |
| 22.09.2015 03:00 - 04:00 | 0 | 0 | 0 | 0 |
| 22.09.2015 04:00 - 05:00 | 0 | 0 | 0 | 0 |
| 22.09.2015 05:00 - 06:00 | 0 | 0 | 0 | 0 |
| 22.09.2015 06:00 - 07:00 | 0 | 0 | 0 | 0 |
| 22.09.2015 07:00 - 08:00 | 0 | 0 | 0 | 0 |
| 22.09.2015 08:00 - 09:00 | 0 | 0 | 0 | 0 |
| 22.09.2015 09:00 - 10:00 | 0 | 0 | 0 | 0 |
| 22.09.2015 10:00 - 11:00 | 0 | 0 | 0 | 0 |
| 22.09.2015 11:00 - 12:00 | 0 | 0 | 0 | 0 |
| 22.09.2015 12:00 - 13:00 | 0 | 0 | 0 | 0 |
| 22.09.2015 13:00 - 14:00 | 0 | 0 | 0 | 0 |
| 22.09.2015 14:00 - 15:00 | 0 | 0 | 0 | 0 |
| 22.09.2015 15:00 - 16:00 | 0 | 0 | 0 | 0 |
| 22.09.2015 16:00 - 17:00 | 0 | 0 | 0 | 0 |
| 22.09.2015 17:00 - 18:00 | 0 | 0 | 0 | 0 |
| 22.09.2015 18:00 - 19:00 | 0 | 0 | 0 | 0 |
| 22.09.2015 19:00 - 20:00 | 0 | 0 | 0 | 0 |
| 22.09.2015 20:00 - 21:00 | 0 | 0 | 0 | 0 |
| 22.09.2015 21:00 - 22:00 | 60 | 0 | 0 | 0 |
| 22.09.2015 22:00 - 23:00 | 60 | 0 | 0 | 0 |
| 22.09.2015 23:00 - 24:00 | 120 | 0 | 0 | 0 |
| 23.09.2015 00:00 - 01:00 | 120 | 0 | 0 | 0 |
| 23.09.2015 01:00 - 02:00 | 120 | 0 | 0 | 0 |
| 23.09.2015 02:00 - 03:00 | 120 | 0 | 0 | 0 |
| 23.09.2015 03:00 - 04:00 | 120 | 0 | 0 | 0 |
| 23.09.2015 04:00 - 05:00 | 120 | 0 | 0 | 0 |
| 23.09.2015 05:00 - 06:00 | 120 | 0 | 0 | 0 |
| 23.09.2015 06:00 - 07:00 | 0 | 0 | 0 | 0 |
| 23.09.2015 07:00 - 08:00 | 0 | 0 | 0 | 0 |
| 23.09.2015 08:00 - 09:00 | 0 | 0 | 0 | 0 |
| 23.09.2015 09:00 - 10:00 | 0 | 0 | 0 | 0 |
| 23.09.2015 10:00 - 11:00 | 0 | 0 | 0 | 0 |
| 23.09.2015 11:00 - 12:00 | 0 | 0 | 0 | 0 |
| 23.09.2015 12:00 - 13:00 | 0 | 0 | 0 | 0 |
| 23.09.2015 13:00 - 14:00 | 0 | 0 | 0 | 0 |
| 23.09.2015 14:00 - 15:00 | 0 | 0 | 0 | 0 |
| 23.09.2015 15:00 - 16:00 | 0 | 0 | 0 | 0 |
| 23.09.2015 16:00 - 17:00 | 0 | 0 | 0 | 0 |
| 23.09.2015 17:00 - 18:00 | 0 | 0 | 0 | 0 |
| 23.09.2015 18:00 - 19:00 | 0 | 0 | 0 | 0 |
| 23.09.2015 19:00 - 20:00 | 0 | 0 | 0 | 0 |
| 23.09.2015 20:00 - 21:00 | 0 | 0 | 0 | 0 |
| 23.09.2015 21:00 - 22:00 | 0 | 0 | 0 | 0 |
| 23.09.2015 22:00 - 23:00 | 60 | 0 | 0 | 0 |
| 23.09.2015 23:00 - 24:00 | 60 | 0 | 0 | 0 |
| 24.09.2015 00:00 - 01:00 | 60 | 0 | 0 | 0 |
| 24.09.2015 01:00 - 02:00 | 60 | 0 | 0 | 0 |
| 24.09.2015 02:00 - 03:00 | 110 | 0 | 0 | 0 |
| 24.09.2015 03:00 - 04:00 | 110 | 0 | 0 | 0 |
| 24.09.2015 04:00 - 05:00 | 110 | 0 | 0 | 0 |
| 24.09.2015 05:00 - 06:00 | 110 | 0 | 0 | 0 |
| 24.09.2015 06:00 - 07:00 | 0 | 0 | 0 | 0 |
| 24.09.2015 07:00 - 08:00 | 0 | 0 | 0 | 0 |
| 24.09.2015 08:00 - 09:00 | 0 | 0 | 0 | 0 |
| 24.09.2015 09:00 - 10:00 | 0 | 0 | 0 | 0 |
| 24.09.2015 10:00 - 11:00 | 0 | 0 | 0 | 0 |
| 24.09.2015 11:00 - 12:00 | 0 | 0 | 0 | 0 |
| 24.09.2015 12:00 - 13:00 | 0 | 0 | 0 | 0 |
| 24.09.2015 13:00 - 14:00 | 0 | 0 | 0 | 0 |
| 24.09.2015 14:00 - 15:00 | 0 | 0 | 0 | 0 |
| 24.09.2015 15:00 - 16:00 | 0 | 0 | 0 | 0 |
| 24.09.2015 16:00 - 17:00 | 0 | 0 | 0 | 0 |
| 24.09.2015 17:00 - 18:00 | 0 | 0 | 0 | 0 |
| 24.09.2015 18:00 - 19:00 | 0 | 0 | 0 | 0 |
| 24.09.2015 19:00 - 20:00 | 80 | 0 | 0 | 0 |
| 24.09.2015 20:00 - 21:00 | 80 | 0 | 0 | 0 |
| 24.09.2015 21:00 - 22:00 | 80 | 0 | 0 | 0 |
| 24.09.2015 22:00 - 23:00 | 80 | 0 | 0 | 0 |
| 24.09.2015 23:00 - 24:00 | 80 | 0 | 0 | 0 |
| 25.09.2015 00:00 - 01:00 | 80 | 0 | 0 | 0 |
| 25.09.2015 01:00 - 02:00 | 80 | 0 | 0 | 0 |
| 25.09.2015 02:00 - 03:00 | 80 | 0 | 0 | 0 |
| 25.09.2015 03:00 - 04:00 | 80 | 0 | 0 | 0 |
| 25.09.2015 04:00 - 05:00 | 80 | 0 | 0 | 0 |
| 25.09.2015 05:00 - 06:00 | 80 | 0 | 0 | 0 |
| 25.09.2015 06:00 - 07:00 | 0 | 0 | 0 | 0 |
| 25.09.2015 07:00 - 08:00 | 0 | 0 | 0 | 0 |
| 25.09.2015 08:00 - 09:00 | 0 | 0 | 0 | 0 |
| 25.09.2015 09:00 - 10:00 | 0 | 0 | 0 | 0 |
| 25.09.2015 10:00 - 11:00 | 0 | 0 | 0 | 0 |
| 25.09.2015 11:00 - 12:00 | 0 | 0 | 0 | 0 |
| 25.09.2015 12:00 - 13:00 | 0 | 0 | 0 | 0 |
| 25.09.2015 13:00 - 14:00 | 0 | 0 | 0 | 0 |
| 25.09.2015 14:00 - 15:00 | 0 | 0 | 0 | 0 |
| 25.09.2015 15:00 - 16:00 | 0 | 0 | 0 | 0 |
| 25.09.2015 16:00 - 17:00 | 0 | 0 | 0 | 0 |
| 25.09.2015 17:00 - 18:00 | 0 | 0 | 0 | 0 |
| 25.09.2015 18:00 - 19:00 | 0 | 0 | 0 | 0 |
| 25.09.2015 19:00 - 20:00 | 0 | 0 | 0 | 0 |
| 25.09.2015 20:00 - 21:00 | 0 | 0 | 0 | 0 |
| 25.09.2015 21:00 - 22:00 | 0 | 0 | 0 | 0 |
| 25.09.2015 22:00 - 23:00 | 0 | 0 | 0 | 0 |
| 25.09.2015 23:00 - 24:00 | 0 | 0 | 0 | 0 |
| 26.09.2015 00:00 - 01:00 | 0 | 0 | 0 | 0 |
| 26.09.2015 01:00 - 02:00 | 0 | 0 | 0 | 0 |
| 26.09.2015 02:00 - 03:00 | 0 | 0 | 0 | 0 |
| 26.09.2015 03:00 - 04:00 | 0 | 0 | 0 | 0 |
| 26.09.2015 04:00 - 05:00 | 0 | 0 | 0 | 0 |
| 26.09.2015 05:00 - 06:00 | 0 | 0 | 0 | 0 |
| 26.09.2015 06:00 - 07:00 | 0 | 0 | 0 | 0 |
| 26.09.2015 07:00 - 08:00 | 0 | 0 | 0 | 0 |
| 26.09.2015 08:00 - 09:00 | 0 | 0 | 0 | 0 |
| 26.09.2015 09:00 - 10:00 | 0 | 0 | 0 | 0 |
| 26.09.2015 10:00 - 11:00 | 0 | 0 | 0 | 0 |
| 26.09.2015 11:00 - 12:00 | 0 | 0 | 0 | 0 |
| 26.09.2015 12:00 - 13:00 | 0 | 0 | 0 | 0 |
| 26.09.2015 13:00 - 14:00 | 0 | 0 | 0 | 0 |
| 26.09.2015 14:00 - 15:00 | 0 | 0 | 0 | 0 |
| 26.09.2015 15:00 - 16:00 | 0 | 0 | 0 | 0 |
| 26.09.2015 16:00 - 17:00 | 0 | 0 | 0 | 0 |
| 26.09.2015 17:00 - 18:00 | 0 | 0 | 0 | 0 |
| 26.09.2015 18:00 - 19:00 | 0 | 0 | 0 | 0 |
| 26.09.2015 19:00 - 20:00 | 0 | 0 | 0 | 0 |
| 26.09.2015 20:00 - 21:00 | 0 | 0 | 0 | 0 |
| 26.09.2015 21:00 - 22:00 | 0 | 0 | 0 | 0 |
| 26.09.2015 22:00 - 23:00 | 0 | 0 | 0 | 0 |
| 26.09.2015 23:00 - 24:00 | 0 | 0 | 0 | 0 |
| 27.09.2015 00:00 - 01:00 | 0 | 0 | 0 | 0 |
| 27.09.2015 01:00 - 02:00 | 0 | 0 | 0 | 0 |
| 27.09.2015 02:00 - 03:00 | 0 | 0 | 0 | 0 |
| 27.09.2015 03:00 - 04:00 | 0 | 0 | 0 | 0 |
| 27.09.2015 04:00 - 05:00 | 0 | 0 | 0 | 0 |
| 27.09.2015 05:00 - 06:00 | 0 | 0 | 0 | 0 |
| 27.09.2015 06:00 - 07:00 | 0 | 0 | 0 | 0 |
| 27.09.2015 07:00 - 08:00 | 0 | 0 | 0 | 0 |
| 27.09.2015 08:00 - 09:00 | 0 | 0 | 0 | 0 |
| 27.09.2015 09:00 - 10:00 | 0 | 0 | 0 | 0 |
| 27.09.2015 10:00 - 11:00 | 0 | 0 | 0 | 0 |
| 27.09.2015 11:00 - 12:00 | 0 | 0 | 0 | 0 |
| 27.09.2015 12:00 - 13:00 | 0 | -50 | 0 | 0 |
| 27.09.2015 13:00 - 14:00 | 0 | -50 | 0 | 0 |
| 27.09.2015 14:00 - 15:00 | 0 | -50 | 0 | 0 |
| 27.09.2015 15:00 - 16:00 | 0 | -50 | 0 | 0 |
| 27.09.2015 16:00 - 17:00 | 0 | -50 | 0 | 0 |
| 27.09.2015 17:00 - 18:00 | 0 | -50 | 0 | 0 |
| 27.09.2015 18:00 - 19:00 | 0 | -50 | 0 | 0 |
| 27.09.2015 19:00 - 20:00 | 0 | -50 | 0 | 0 |
| 27.09.2015 20:00 - 21:00 | 0 | -50 | 0 | 0 |
| 27.09.2015 21:00 - 22:00 | 0 | -50 | 0 | 0 |
| 27.09.2015 22:00 - 23:00 | 0 | -50 | 0 | 0 |
| 27.09.2015 23:00 - 24:00 | 0 | -50 | 0 | 0 |
| 28.09.2015 00:00 - 01:00 | 0 | -50 | 0 | 0 |
| 28.09.2015 01:00 - 02:00 | 0 | -50 | 0 | 0 |
| 28.09.2015 02:00 - 03:00 | 0 | -50 | 0 | 0 |
| 28.09.2015 03:00 - 04:00 | 0 | -50 | 0 | 0 |
| 28.09.2015 04:00 - 05:00 | 0 | -50 | 0 | 0 |
| 28.09.2015 05:00 - 06:00 | 0 | -50 | 0 | 0 |
| 28.09.2015 06:00 - 07:00 | 0 | 0 | 0 | 0 |
| 28.09.2015 07:00 - 08:00 | 0 | 0 | 0 | 0 |
| 28.09.2015 08:00 - 09:00 | 0 | 0 | 0 | 0 |
| 28.09.2015 09:00 - 10:00 | 0 | 0 | 0 | 0 |
| 28.09.2015 10:00 - 11:00 | 0 | 0 | 0 | 0 |
| 28.09.2015 11:00 - 12:00 | 0 | 0 | 0 | 0 |
| 28.09.2015 12:00 - 13:00 | 0 | 0 | 0 | 0 |
| 28.09.2015 13:00 - 14:00 | 0 | 0 | 0 | 0 |
| 28.09.2015 14:00 - 15:00 | 60 | 0 | 0 | 0 |
| 28.09.2015 15:00 - 16:00 | 60 | 0 | 0 | 0 |
| 28.09.2015 16:00 - 17:00 | 60 | 0 | 0 | 0 |
| 28.09.2015 17:00 - 18:00 | 60 | 0 | 0 | 0 |
| 28.09.2015 18:00 - 19:00 | 60 | 0 | 0 | 0 |
| 28.09.2015 19:00 - 20:00 | 140 | 0 | 0 | 0 |
| 28.09.2015 20:00 - 21:00 | 140 | 0 | 0 | 0 |
| 28.09.2015 21:00 - 22:00 | 140 | 0 | 0 | 0 |
| 28.09.2015 22:00 - 23:00 | 140 | 0 | 0 | 0 |
| 28.09.2015 23:00 - 24:00 | 200 | 0 | 0 | 0 |
| 29.09.2015 00:00 - 01:00 | 200 | 0 | 0 | 0 |
| 29.09.2015 01:00 - 02:00 | 200 | 0 | 0 | 0 |
| 29.09.2015 02:00 - 03:00 | 200 | 0 | 0 | 0 |
| 29.09.2015 03:00 - 04:00 | 200 | 0 | 0 | 0 |
| 29.09.2015 04:00 - 05:00 | 200 | 0 | 0 | 0 |
| 29.09.2015 05:00 - 06:00 | 200 | 0 | 0 | 0 |
| 29.09.2015 06:00 - 07:00 | 0 | 0 | 0 | 0 |
| 29.09.2015 07:00 - 08:00 | 0 | 0 | 0 | 0 |
| 29.09.2015 08:00 - 09:00 | 0 | 0 | 0 | 0 |
| 29.09.2015 09:00 - 10:00 | 0 | 0 | 0 | 0 |
| 29.09.2015 10:00 - 11:00 | 0 | 0 | 0 | 0 |
| 29.09.2015 11:00 - 12:00 | 0 | 0 | 0 | 0 |
| 29.09.2015 12:00 - 13:00 | 0 | 0 | 0 | 0 |
| 29.09.2015 13:00 - 14:00 | 0 | 0 | 0 | 0 |
| 29.09.2015 14:00 - 15:00 | 0 | 0 | 0 | 0 |
| 29.09.2015 15:00 - 16:00 | 0 | 0 | 0 | 0 |
| 29.09.2015 16:00 - 17:00 | 80 | 0 | 0 | 0 |
| 29.09.2015 17:00 - 18:00 | 80 | 0 | 0 | 0 |
| 29.09.2015 18:00 - 19:00 | 80 | 0 | 0 | 0 |
| 29.09.2015 19:00 - 20:00 | 80 | 0 | 0 | 0 |
| 29.09.2015 20:00 - 21:00 | 80 | 0 | 0 | 0 |
| 29.09.2015 21:00 - 22:00 | 80 | 0 | 0 | 0 |
| 29.09.2015 22:00 - 23:00 | 80 | 0 | 0 | 0 |
| 29.09.2015 23:00 - 24:00 | 80 | 0 | 0 | 0 |
| 30.09.2015 00:00 - 01:00 | 80 | 0 | 0 | 0 |
| 30.09.2015 01:00 - 02:00 | 80 | 0 | 0 | 0 |
| 30.09.2015 02:00 - 03:00 | 80 | 0 | 0 | 0 |
| 30.09.2015 03:00 - 04:00 | 80 | 0 | 0 | 0 |
| 30.09.2015 04:00 - 05:00 | 80 | 0 | 0 | 0 |
| 30.09.2015 05:00 - 06:00 | 80 | 0 | 0 | 0 |
| 30.09.2015 06:00 - 07:00 | 0 | 0 | 0 | 0 |
| 30.09.2015 07:00 - 08:00 | 0 | 0 | 0 | 0 |
| 30.09.2015 08:00 - 09:00 | 0 | 0 | 0 | 0 |
| 30.09.2015 09:00 - 10:00 | 0 | 0 | 0 | 0 |
| 30.09.2015 10:00 - 11:00 | 0 | 0 | 0 | 0 |
| 30.09.2015 11:00 - 12:00 | 0 | 0 | 0 | 0 |
| 30.09.2015 12:00 - 13:00 | 0 | 0 | 0 | 0 |
| 30.09.2015 13:00 - 14:00 | 0 | 0 | 0 | 0 |
| 30.09.2015 14:00 - 15:00 | 0 | 0 | 0 | 0 |
| 30.09.2015 15:00 - 16:00 | 0 | 0 | 0 | 0 |
| 30.09.2015 16:00 - 17:00 | 0 | 0 | 0 | 0 |
| 30.09.2015 17:00 - 18:00 | 0 | 0 | 0 | 0 |
| 30.09.2015 18:00 - 19:00 | 0 | 0 | 0 | 0 |
| 30.09.2015 19:00 - 20:00 | 0 | 0 | 0 | 0 |
| 30.09.2015 20:00 - 21:00 | 0 | 0 | 0 | 0 |
| 30.09.2015 21:00 - 22:00 | 0 | 0 | 0 | 0 |
| 30.09.2015 22:00 - 23:00 | 0 | 0 | 0 | 0 |
| 30.09.2015 23:00 - 24:00 | 0 | 0 | 0 | 0 |
| 01.10.2015 00:00 - 01:00 | 0 | 0 | 0 | 0 |
| 01.10.2015 01:00 - 02:00 | 0 | 0 | 0 | 0 |
| 01.10.2015 02:00 - 03:00 | 0 | 0 | 0 | 0 |
| 01.10.2015 03:00 - 04:00 | 0 | 0 | 0 | 0 |
| 01.10.2015 04:00 - 05:00 | 0 | 0 | 0 | 0 |
| 01.10.2015 05:00 - 06:00 | 0 | 0 | 0 | 0 |